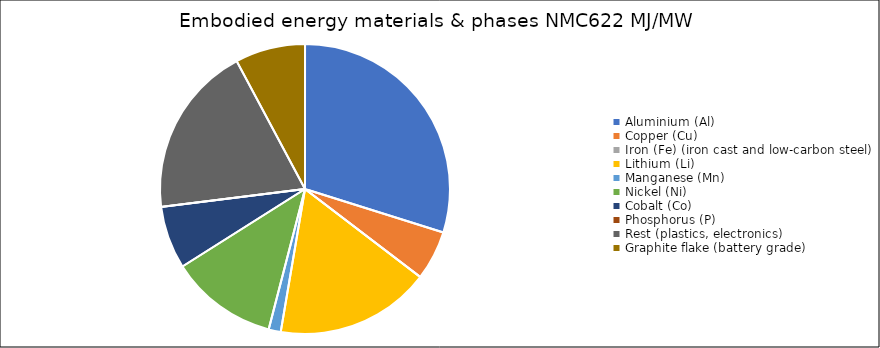
| Category | Embodied energy materials & phases NMC622 |
|---|---|
| Aluminium (Al) | 126278.46 |
| Copper (Cu) | 23397.66 |
| Iron (Fe) (iron cast and low-carbon steel) | 0 |
| Lithium (Li) | 73187.4 |
| Manganese (Mn) | 5727.744 |
| Nickel (Ni) | 50757.201 |
| Cobalt (Co) | 29594.4 |
| Phosphorus (P) | 0 |
| Rest (plastics, electronics) | 81094.09 |
| Graphite flake (battery grade) | 33061.6 |